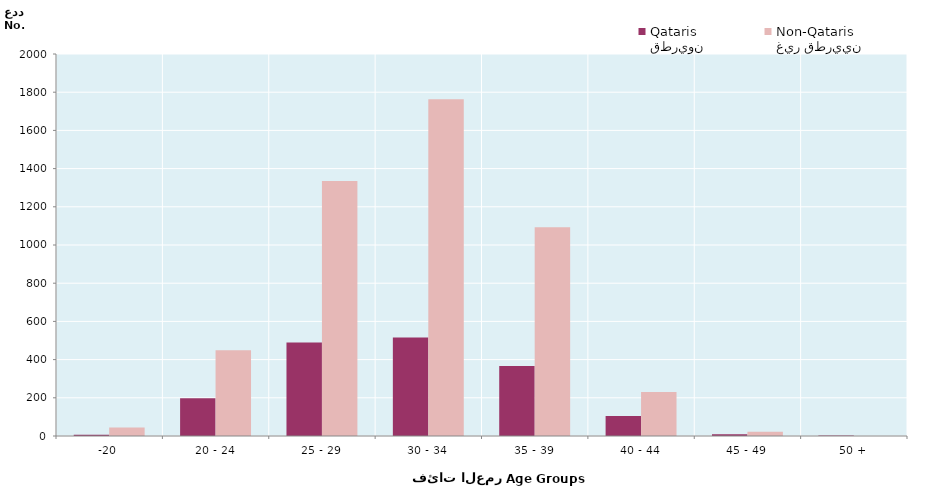
| Category | قطريون
Qataris | غير قطريين
Non-Qataris |
|---|---|---|
| -20 | 6 | 44 |
| 20 - 24 | 197 | 449 |
| 25 - 29 | 489 | 1335 |
| 30 - 34 | 516 | 1763 |
| 35 - 39 | 367 | 1093 |
| 40 - 44 | 105 | 231 |
| 45 - 49 | 9 | 22 |
| 50 + | 2 | 0 |